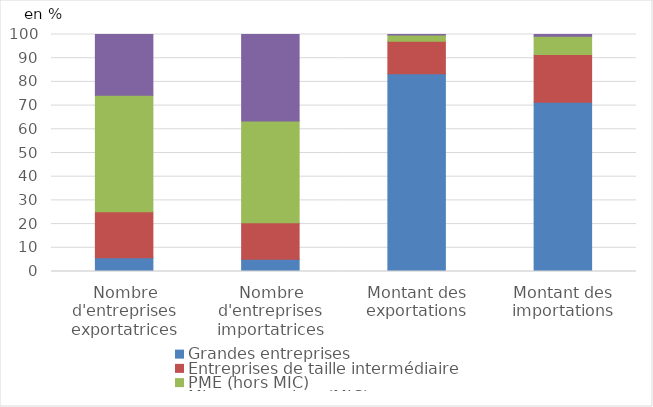
| Category | Grandes entreprises | Entreprises de taille intermédiaire | PME (hors MIC) | Microentreprises (MIC) |
|---|---|---|---|---|
| Nombre d'entreprises exportatrices | 5.8 | 19.4 | 49.2 | 25.6 |
| Nombre d'entreprises importatrices | 5.2 | 15.4 | 42.9 | 36.6 |
| Montant des exportations | 83.4 | 13.7 | 2.7 | 0.2 |
| Montant des importations | 71.4 | 20.2 | 7.7 | 0.7 |